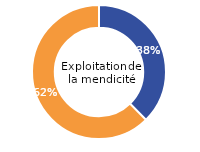
| Category | Series 0 |
|---|---|
| Femmes | 37.662 |
| Hommes | 62.338 |